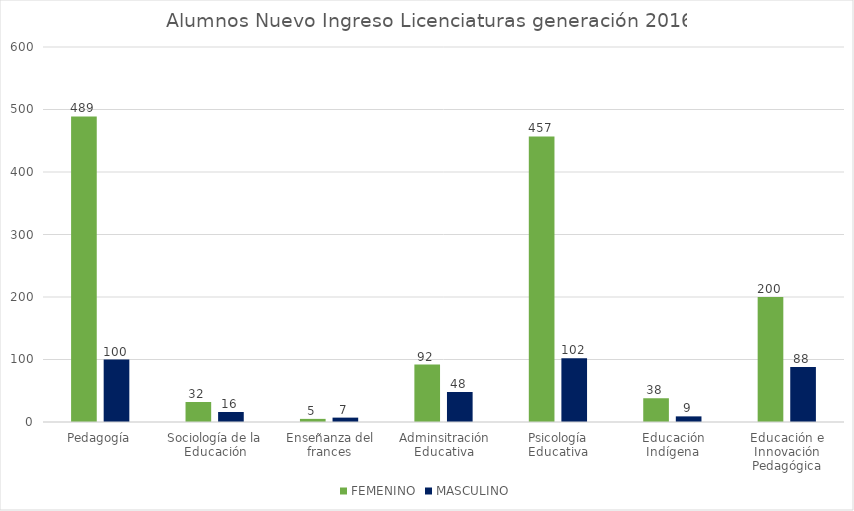
| Category | FEMENINO | MASCULINO |
|---|---|---|
| Pedagogía | 489 | 100 |
| Sociología de la Educación | 32 | 16 |
| Enseñanza del frances | 5 | 7 |
| Adminsitración Educativa | 92 | 48 |
| Psicología Educativa | 457 | 102 |
| Educación Indígena | 38 | 9 |
| Educación e Innovación Pedagógica | 200 | 88 |